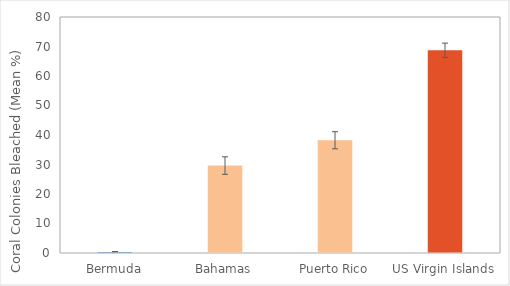
| Category | Series 0 |
|---|---|
| Bermuda | 0.38 |
| Bahamas | 29.637 |
| Puerto Rico | 38.222 |
| US Virgin Islands | 68.718 |